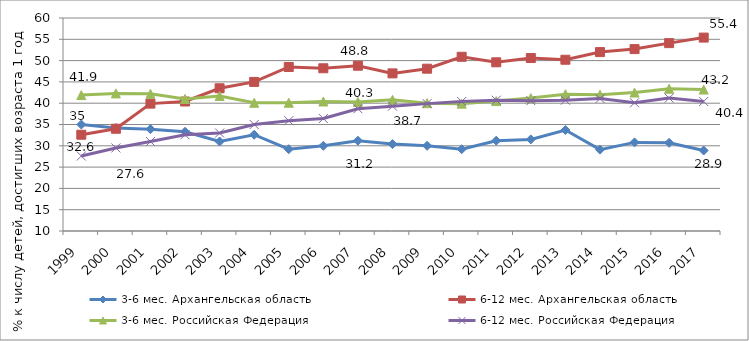
| Category | 3-6 мес. Архангельская область | 6-12 мес. Архангельская область | 3-6 мес. Российская Федерация | 6-12 мес. Российская Федерация |
|---|---|---|---|---|
| 1999.0 | 35 | 32.6 | 41.9 | 27.6 |
| 2000.0 | 34.2 | 34 | 42.3 | 29.5 |
| 2001.0 | 33.9 | 39.9 | 42.2 | 31 |
| 2002.0 | 33.3 | 40.4 | 41 | 32.6 |
| 2003.0 | 31 | 43.5 | 41.7 | 33 |
| 2004.0 | 32.6 | 45 | 40.1 | 35 |
| 2005.0 | 29.2 | 48.5 | 40.1 | 35.9 |
| 2006.0 | 30 | 48.2 | 40.4 | 36.4 |
| 2007.0 | 31.2 | 48.8 | 40.3 | 38.7 |
| 2008.0 | 30.4 | 47 | 40.8 | 39.3 |
| 2009.0 | 30 | 48.1 | 40 | 39.9 |
| 2010.0 | 29.2 | 50.9 | 39.9 | 40.4 |
| 2011.0 | 31.2 | 49.6 | 40.5 | 40.7 |
| 2012.0 | 31.5 | 50.6 | 41.2 | 40.6 |
| 2013.0 | 33.7 | 50.2 | 42.1 | 40.7 |
| 2014.0 | 29.1 | 52 | 42 | 41.1 |
| 2015.0 | 30.8 | 52.7 | 42.5 | 40.1 |
| 2016.0 | 30.7 | 54.1 | 43.4 | 41.2 |
| 2017.0 | 28.9 | 55.4 | 43.2 | 40.4 |